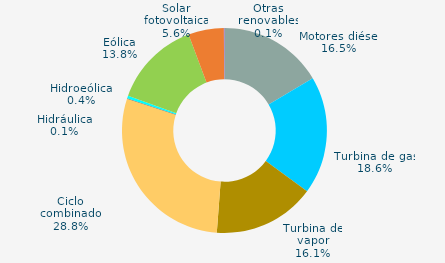
| Category | Series 0 |
|---|---|
| Motores diésel | 16.5 |
| Turbina de gas | 18.6 |
| Turbina de vapor | 16.1 |
| Ciclo combinado | 28.8 |
| Cogeneración | 0 |
| Hidráulica | 0.1 |
| Hidroeólica | 0.4 |
| Eólica | 13.8 |
| Solar fotovoltaica | 5.6 |
| Otras renovables | 0.1 |